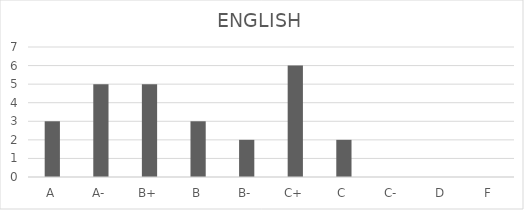
| Category | ENGLISH |
|---|---|
| A | 3 |
| A- | 5 |
| B+ | 5 |
| B | 3 |
| B- | 2 |
| C+ | 6 |
| C | 2 |
| C- | 0 |
| D | 0 |
| F | 0 |